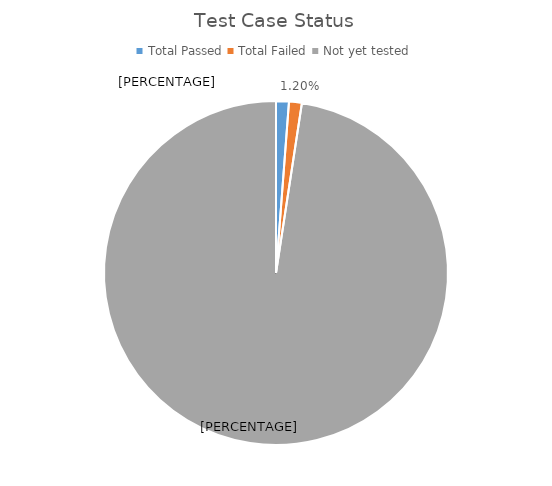
| Category | Series 0 |
|---|---|
| Total Passed | 1 |
| Total Failed | 1 |
| Not yet tested | 81 |